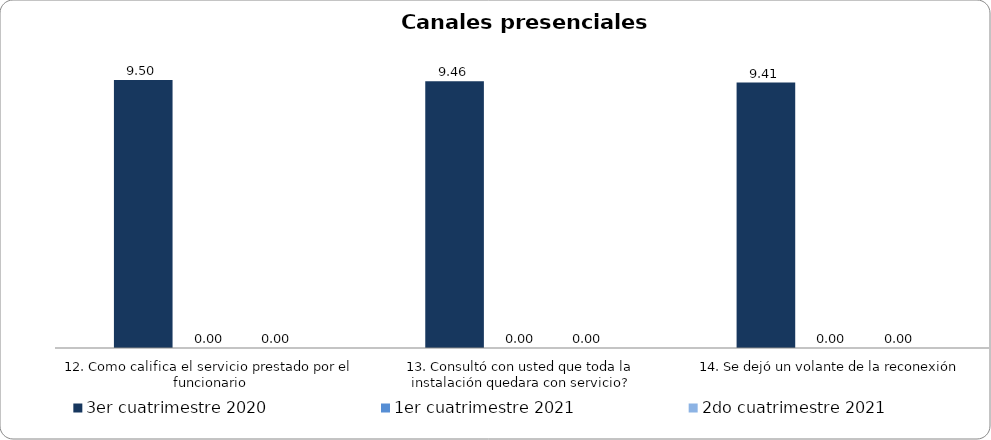
| Category | 3er cuatrimestre 2020 | Septiembre - Octubre 2018 | 1er cuatrimestre 2021 | Noviembre - Diciembre 2018 | 1er cuatrimestre 2019 | 2do cuatrimestre 2019 | 2do cuatrimestre 2021 |
|---|---|---|---|---|---|---|---|
| 12. Como califica el servicio prestado por el funcionario | 9.5 |  | 0 |  |  |  | 0 |
| 13. Consultó con usted que toda la instalación quedara con servicio? | 9.459 |  | 0 |  |  |  | 0 |
| 14. Se dejó un volante de la reconexión | 9.412 |  | 0 |  |  |  | 0 |